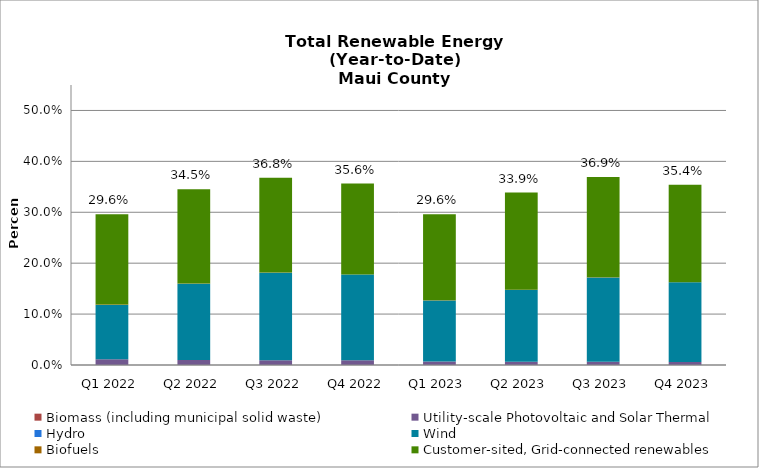
| Category | Biomass (including municipal solid waste) | Utility-scale Photovoltaic and Solar Thermal | Hydro | Wind | Biofuels | Customer-sited, Grid-connected renewables |
|---|---|---|---|---|---|---|
| Q1 2022 | 0 | 0.011 | 0 | 0.107 | 0.001 | 0.177 |
| Q2 2022 | 0 | 0.01 | 0 | 0.15 | 0.001 | 0.185 |
| Q3 2022 | 0 | 0.009 | 0 | 0.172 | 0.001 | 0.186 |
| Q4 2022 | 0 | 0.009 | 0 | 0.168 | 0 | 0.178 |
| Q1 2023 | 0 | 0.007 | 0 | 0.12 | 0 | 0.169 |
| Q2 2023 | 0 | 0.007 | 0 | 0.141 | 0 | 0.191 |
| Q3 2023 | 0 | 0.006 | 0 | 0.166 | 0 | 0.197 |
| Q4 2023 | 0 | 0.006 | 0 | 0.157 | 0 | 0.191 |